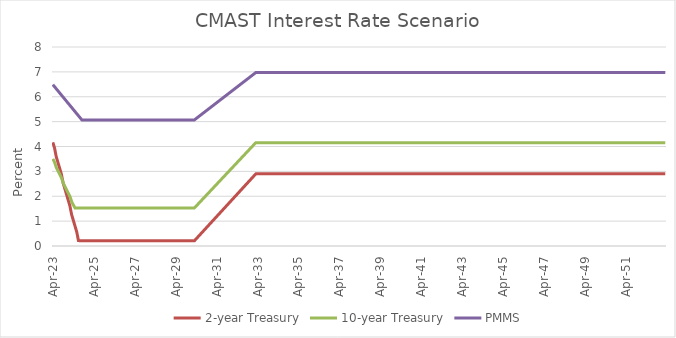
| Category | 2-year Treasury | 10-year Treasury | PMMS |
|---|---|---|---|
| 2023-04-30 | 4.168 | 3.503 | 6.487 |
| 2023-05-30 | 3.935 | 3.366 | 6.403 |
| 2023-06-30 | 3.587 | 3.16 | 6.32 |
| 2023-07-30 | 3.355 | 3.023 | 6.237 |
| 2023-08-30 | 3.122 | 2.886 | 6.153 |
| 2023-09-30 | 2.89 | 2.749 | 6.07 |
| 2023-10-30 | 2.542 | 2.543 | 5.987 |
| 2023-11-30 | 2.309 | 2.406 | 5.903 |
| 2023-12-30 | 2.077 | 2.269 | 5.82 |
| 2024-01-30 | 1.845 | 2.132 | 5.737 |
| 2024-02-29 | 1.612 | 1.994 | 5.653 |
| 2024-03-29 | 1.264 | 1.789 | 5.57 |
| 2024-04-29 | 1.031 | 1.652 | 5.487 |
| 2024-05-29 | 0.799 | 1.53 | 5.403 |
| 2024-06-29 | 0.567 | 1.53 | 5.32 |
| 2024-07-29 | 0.218 | 1.53 | 5.237 |
| 2024-08-29 | 0.21 | 1.53 | 5.153 |
| 2024-09-29 | 0.21 | 1.53 | 5.07 |
| 2024-10-29 | 0.21 | 1.53 | 5.07 |
| 2024-11-29 | 0.21 | 1.53 | 5.07 |
| 2024-12-29 | 0.21 | 1.53 | 5.07 |
| 2025-01-29 | 0.21 | 1.53 | 5.07 |
| 2025-02-28 | 0.21 | 1.53 | 5.07 |
| 2025-03-28 | 0.21 | 1.53 | 5.07 |
| 2025-04-28 | 0.21 | 1.53 | 5.07 |
| 2025-05-28 | 0.21 | 1.53 | 5.07 |
| 2025-06-28 | 0.21 | 1.53 | 5.07 |
| 2025-07-28 | 0.21 | 1.53 | 5.07 |
| 2025-08-28 | 0.21 | 1.53 | 5.07 |
| 2025-09-28 | 0.21 | 1.53 | 5.07 |
| 2025-10-28 | 0.21 | 1.53 | 5.07 |
| 2025-11-28 | 0.21 | 1.53 | 5.07 |
| 2025-12-28 | 0.21 | 1.53 | 5.07 |
| 2026-01-28 | 0.21 | 1.53 | 5.07 |
| 2026-02-28 | 0.21 | 1.53 | 5.07 |
| 2026-03-28 | 0.21 | 1.53 | 5.07 |
| 2026-04-28 | 0.21 | 1.53 | 5.07 |
| 2026-05-28 | 0.21 | 1.53 | 5.07 |
| 2026-06-28 | 0.21 | 1.53 | 5.07 |
| 2026-07-28 | 0.21 | 1.53 | 5.07 |
| 2026-08-28 | 0.21 | 1.53 | 5.07 |
| 2026-09-28 | 0.21 | 1.53 | 5.07 |
| 2026-10-28 | 0.21 | 1.53 | 5.07 |
| 2026-11-28 | 0.21 | 1.53 | 5.07 |
| 2026-12-28 | 0.21 | 1.53 | 5.07 |
| 2027-01-28 | 0.21 | 1.53 | 5.07 |
| 2027-02-28 | 0.21 | 1.53 | 5.07 |
| 2027-03-28 | 0.21 | 1.53 | 5.07 |
| 2027-04-28 | 0.21 | 1.53 | 5.07 |
| 2027-05-28 | 0.21 | 1.53 | 5.07 |
| 2027-06-28 | 0.21 | 1.53 | 5.07 |
| 2027-07-28 | 0.21 | 1.53 | 5.07 |
| 2027-08-28 | 0.21 | 1.53 | 5.07 |
| 2027-09-28 | 0.21 | 1.53 | 5.07 |
| 2027-10-28 | 0.21 | 1.53 | 5.07 |
| 2027-11-28 | 0.21 | 1.53 | 5.07 |
| 2027-12-28 | 0.21 | 1.53 | 5.07 |
| 2028-01-28 | 0.21 | 1.53 | 5.07 |
| 2028-02-28 | 0.21 | 1.53 | 5.07 |
| 2028-03-28 | 0.21 | 1.53 | 5.07 |
| 2028-04-28 | 0.21 | 1.53 | 5.07 |
| 2028-05-28 | 0.21 | 1.53 | 5.07 |
| 2028-06-28 | 0.21 | 1.53 | 5.07 |
| 2028-07-28 | 0.21 | 1.53 | 5.07 |
| 2028-08-28 | 0.21 | 1.53 | 5.07 |
| 2028-09-28 | 0.21 | 1.53 | 5.07 |
| 2028-10-28 | 0.21 | 1.53 | 5.07 |
| 2028-11-28 | 0.21 | 1.53 | 5.07 |
| 2028-12-28 | 0.21 | 1.53 | 5.07 |
| 2029-01-28 | 0.21 | 1.53 | 5.07 |
| 2029-02-28 | 0.21 | 1.53 | 5.07 |
| 2029-03-28 | 0.21 | 1.53 | 5.07 |
| 2029-04-28 | 0.21 | 1.53 | 5.07 |
| 2029-05-28 | 0.21 | 1.53 | 5.07 |
| 2029-06-28 | 0.21 | 1.53 | 5.07 |
| 2029-07-28 | 0.21 | 1.53 | 5.07 |
| 2029-08-28 | 0.21 | 1.53 | 5.07 |
| 2029-09-28 | 0.21 | 1.53 | 5.07 |
| 2029-10-28 | 0.21 | 1.53 | 5.07 |
| 2029-11-28 | 0.21 | 1.53 | 5.07 |
| 2029-12-28 | 0.21 | 1.53 | 5.07 |
| 2030-01-28 | 0.21 | 1.53 | 5.07 |
| 2030-02-28 | 0.21 | 1.53 | 5.07 |
| 2030-03-28 | 0.21 | 1.53 | 5.07 |
| 2030-04-28 | 0.285 | 1.603 | 5.123 |
| 2030-05-28 | 0.359 | 1.676 | 5.176 |
| 2030-06-28 | 0.434 | 1.749 | 5.229 |
| 2030-07-28 | 0.509 | 1.822 | 5.281 |
| 2030-08-28 | 0.584 | 1.895 | 5.334 |
| 2030-09-28 | 0.658 | 1.968 | 5.387 |
| 2030-10-28 | 0.733 | 2.04 | 5.44 |
| 2030-11-28 | 0.808 | 2.113 | 5.493 |
| 2030-12-28 | 0.883 | 2.186 | 5.546 |
| 2031-01-28 | 0.957 | 2.259 | 5.599 |
| 2031-02-28 | 1.032 | 2.332 | 5.652 |
| 2031-03-28 | 1.107 | 2.405 | 5.704 |
| 2031-04-28 | 1.181 | 2.478 | 5.757 |
| 2031-05-28 | 1.256 | 2.551 | 5.81 |
| 2031-06-28 | 1.331 | 2.624 | 5.863 |
| 2031-07-28 | 1.406 | 2.697 | 5.916 |
| 2031-08-28 | 1.48 | 2.77 | 5.969 |
| 2031-09-28 | 1.555 | 2.843 | 6.022 |
| 2031-10-28 | 1.63 | 2.915 | 6.074 |
| 2031-11-28 | 1.704 | 2.988 | 6.127 |
| 2031-12-28 | 1.779 | 3.061 | 6.18 |
| 2032-01-28 | 1.854 | 3.134 | 6.233 |
| 2032-02-28 | 1.929 | 3.207 | 6.286 |
| 2032-03-28 | 2.003 | 3.28 | 6.339 |
| 2032-04-28 | 2.078 | 3.353 | 6.392 |
| 2032-05-28 | 2.153 | 3.426 | 6.444 |
| 2032-06-28 | 2.228 | 3.499 | 6.497 |
| 2032-07-28 | 2.302 | 3.572 | 6.55 |
| 2032-08-28 | 2.377 | 3.645 | 6.603 |
| 2032-09-28 | 2.452 | 3.718 | 6.656 |
| 2032-10-28 | 2.526 | 3.79 | 6.709 |
| 2032-11-28 | 2.601 | 3.863 | 6.762 |
| 2032-12-28 | 2.676 | 3.936 | 6.815 |
| 2033-01-28 | 2.751 | 4.009 | 6.867 |
| 2033-02-28 | 2.825 | 4.082 | 6.92 |
| 2033-03-28 | 2.9 | 4.155 | 6.973 |
| 2033-04-28 | 2.9 | 4.155 | 6.973 |
| 2033-05-28 | 2.9 | 4.155 | 6.973 |
| 2033-06-28 | 2.9 | 4.155 | 6.973 |
| 2033-07-28 | 2.9 | 4.155 | 6.973 |
| 2033-08-28 | 2.9 | 4.155 | 6.973 |
| 2033-09-28 | 2.9 | 4.155 | 6.973 |
| 2033-10-28 | 2.9 | 4.155 | 6.973 |
| 2033-11-28 | 2.9 | 4.155 | 6.973 |
| 2033-12-28 | 2.9 | 4.155 | 6.973 |
| 2034-01-28 | 2.9 | 4.155 | 6.973 |
| 2034-02-28 | 2.9 | 4.155 | 6.973 |
| 2034-03-28 | 2.9 | 4.155 | 6.973 |
| 2034-04-28 | 2.9 | 4.155 | 6.973 |
| 2034-05-28 | 2.9 | 4.155 | 6.973 |
| 2034-06-28 | 2.9 | 4.155 | 6.973 |
| 2034-07-28 | 2.9 | 4.155 | 6.973 |
| 2034-08-28 | 2.9 | 4.155 | 6.973 |
| 2034-09-28 | 2.9 | 4.155 | 6.973 |
| 2034-10-28 | 2.9 | 4.155 | 6.973 |
| 2034-11-28 | 2.9 | 4.155 | 6.973 |
| 2034-12-28 | 2.9 | 4.155 | 6.973 |
| 2035-01-28 | 2.9 | 4.155 | 6.973 |
| 2035-02-28 | 2.9 | 4.155 | 6.973 |
| 2035-03-28 | 2.9 | 4.155 | 6.973 |
| 2035-04-28 | 2.9 | 4.155 | 6.973 |
| 2035-05-28 | 2.9 | 4.155 | 6.973 |
| 2035-06-28 | 2.9 | 4.155 | 6.973 |
| 2035-07-28 | 2.9 | 4.155 | 6.973 |
| 2035-08-28 | 2.9 | 4.155 | 6.973 |
| 2035-09-28 | 2.9 | 4.155 | 6.973 |
| 2035-10-28 | 2.9 | 4.155 | 6.973 |
| 2035-11-28 | 2.9 | 4.155 | 6.973 |
| 2035-12-28 | 2.9 | 4.155 | 6.973 |
| 2036-01-28 | 2.9 | 4.155 | 6.973 |
| 2036-02-28 | 2.9 | 4.155 | 6.973 |
| 2036-03-28 | 2.9 | 4.155 | 6.973 |
| 2036-04-28 | 2.9 | 4.155 | 6.973 |
| 2036-05-28 | 2.9 | 4.155 | 6.973 |
| 2036-06-28 | 2.9 | 4.155 | 6.973 |
| 2036-07-28 | 2.9 | 4.155 | 6.973 |
| 2036-08-28 | 2.9 | 4.155 | 6.973 |
| 2036-09-28 | 2.9 | 4.155 | 6.973 |
| 2036-10-28 | 2.9 | 4.155 | 6.973 |
| 2036-11-28 | 2.9 | 4.155 | 6.973 |
| 2036-12-28 | 2.9 | 4.155 | 6.973 |
| 2037-01-28 | 2.9 | 4.155 | 6.973 |
| 2037-02-28 | 2.9 | 4.155 | 6.973 |
| 2037-03-28 | 2.9 | 4.155 | 6.973 |
| 2037-04-28 | 2.9 | 4.155 | 6.973 |
| 2037-05-28 | 2.9 | 4.155 | 6.973 |
| 2037-06-28 | 2.9 | 4.155 | 6.973 |
| 2037-07-28 | 2.9 | 4.155 | 6.973 |
| 2037-08-28 | 2.9 | 4.155 | 6.973 |
| 2037-09-28 | 2.9 | 4.155 | 6.973 |
| 2037-10-28 | 2.9 | 4.155 | 6.973 |
| 2037-11-28 | 2.9 | 4.155 | 6.973 |
| 2037-12-28 | 2.9 | 4.155 | 6.973 |
| 2038-01-28 | 2.9 | 4.155 | 6.973 |
| 2038-02-28 | 2.9 | 4.155 | 6.973 |
| 2038-03-28 | 2.9 | 4.155 | 6.973 |
| 2038-04-28 | 2.9 | 4.155 | 6.973 |
| 2038-05-28 | 2.9 | 4.155 | 6.973 |
| 2038-06-28 | 2.9 | 4.155 | 6.973 |
| 2038-07-28 | 2.9 | 4.155 | 6.973 |
| 2038-08-28 | 2.9 | 4.155 | 6.973 |
| 2038-09-28 | 2.9 | 4.155 | 6.973 |
| 2038-10-28 | 2.9 | 4.155 | 6.973 |
| 2038-11-28 | 2.9 | 4.155 | 6.973 |
| 2038-12-28 | 2.9 | 4.155 | 6.973 |
| 2039-01-28 | 2.9 | 4.155 | 6.973 |
| 2039-02-28 | 2.9 | 4.155 | 6.973 |
| 2039-03-28 | 2.9 | 4.155 | 6.973 |
| 2039-04-28 | 2.9 | 4.155 | 6.973 |
| 2039-05-28 | 2.9 | 4.155 | 6.973 |
| 2039-06-28 | 2.9 | 4.155 | 6.973 |
| 2039-07-28 | 2.9 | 4.155 | 6.973 |
| 2039-08-28 | 2.9 | 4.155 | 6.973 |
| 2039-09-28 | 2.9 | 4.155 | 6.973 |
| 2039-10-28 | 2.9 | 4.155 | 6.973 |
| 2039-11-28 | 2.9 | 4.155 | 6.973 |
| 2039-12-28 | 2.9 | 4.155 | 6.973 |
| 2040-01-28 | 2.9 | 4.155 | 6.973 |
| 2040-02-28 | 2.9 | 4.155 | 6.973 |
| 2040-03-28 | 2.9 | 4.155 | 6.973 |
| 2040-04-28 | 2.9 | 4.155 | 6.973 |
| 2040-05-28 | 2.9 | 4.155 | 6.973 |
| 2040-06-28 | 2.9 | 4.155 | 6.973 |
| 2040-07-28 | 2.9 | 4.155 | 6.973 |
| 2040-08-28 | 2.9 | 4.155 | 6.973 |
| 2040-09-28 | 2.9 | 4.155 | 6.973 |
| 2040-10-28 | 2.9 | 4.155 | 6.973 |
| 2040-11-28 | 2.9 | 4.155 | 6.973 |
| 2040-12-28 | 2.9 | 4.155 | 6.973 |
| 2041-01-28 | 2.9 | 4.155 | 6.973 |
| 2041-02-28 | 2.9 | 4.155 | 6.973 |
| 2041-03-28 | 2.9 | 4.155 | 6.973 |
| 2041-04-28 | 2.9 | 4.155 | 6.973 |
| 2041-05-28 | 2.9 | 4.155 | 6.973 |
| 2041-06-28 | 2.9 | 4.155 | 6.973 |
| 2041-07-28 | 2.9 | 4.155 | 6.973 |
| 2041-08-28 | 2.9 | 4.155 | 6.973 |
| 2041-09-28 | 2.9 | 4.155 | 6.973 |
| 2041-10-28 | 2.9 | 4.155 | 6.973 |
| 2041-11-28 | 2.9 | 4.155 | 6.973 |
| 2041-12-28 | 2.9 | 4.155 | 6.973 |
| 2042-01-28 | 2.9 | 4.155 | 6.973 |
| 2042-02-28 | 2.9 | 4.155 | 6.973 |
| 2042-03-28 | 2.9 | 4.155 | 6.973 |
| 2042-04-28 | 2.9 | 4.155 | 6.973 |
| 2042-05-28 | 2.9 | 4.155 | 6.973 |
| 2042-06-28 | 2.9 | 4.155 | 6.973 |
| 2042-07-28 | 2.9 | 4.155 | 6.973 |
| 2042-08-28 | 2.9 | 4.155 | 6.973 |
| 2042-09-28 | 2.9 | 4.155 | 6.973 |
| 2042-10-28 | 2.9 | 4.155 | 6.973 |
| 2042-11-28 | 2.9 | 4.155 | 6.973 |
| 2042-12-28 | 2.9 | 4.155 | 6.973 |
| 2043-01-28 | 2.9 | 4.155 | 6.973 |
| 2043-02-28 | 2.9 | 4.155 | 6.973 |
| 2043-03-28 | 2.9 | 4.155 | 6.973 |
| 2043-04-28 | 2.9 | 4.155 | 6.973 |
| 2043-05-28 | 2.9 | 4.155 | 6.973 |
| 2043-06-28 | 2.9 | 4.155 | 6.973 |
| 2043-07-28 | 2.9 | 4.155 | 6.973 |
| 2043-08-28 | 2.9 | 4.155 | 6.973 |
| 2043-09-28 | 2.9 | 4.155 | 6.973 |
| 2043-10-28 | 2.9 | 4.155 | 6.973 |
| 2043-11-28 | 2.9 | 4.155 | 6.973 |
| 2043-12-28 | 2.9 | 4.155 | 6.973 |
| 2044-01-28 | 2.9 | 4.155 | 6.973 |
| 2044-02-28 | 2.9 | 4.155 | 6.973 |
| 2044-03-28 | 2.9 | 4.155 | 6.973 |
| 2044-04-28 | 2.9 | 4.155 | 6.973 |
| 2044-05-28 | 2.9 | 4.155 | 6.973 |
| 2044-06-28 | 2.9 | 4.155 | 6.973 |
| 2044-07-28 | 2.9 | 4.155 | 6.973 |
| 2044-08-28 | 2.9 | 4.155 | 6.973 |
| 2044-09-28 | 2.9 | 4.155 | 6.973 |
| 2044-10-28 | 2.9 | 4.155 | 6.973 |
| 2044-11-28 | 2.9 | 4.155 | 6.973 |
| 2044-12-28 | 2.9 | 4.155 | 6.973 |
| 2045-01-28 | 2.9 | 4.155 | 6.973 |
| 2045-02-28 | 2.9 | 4.155 | 6.973 |
| 2045-03-28 | 2.9 | 4.155 | 6.973 |
| 2045-04-28 | 2.9 | 4.155 | 6.973 |
| 2045-05-28 | 2.9 | 4.155 | 6.973 |
| 2045-06-28 | 2.9 | 4.155 | 6.973 |
| 2045-07-28 | 2.9 | 4.155 | 6.973 |
| 2045-08-28 | 2.9 | 4.155 | 6.973 |
| 2045-09-28 | 2.9 | 4.155 | 6.973 |
| 2045-10-28 | 2.9 | 4.155 | 6.973 |
| 2045-11-28 | 2.9 | 4.155 | 6.973 |
| 2045-12-28 | 2.9 | 4.155 | 6.973 |
| 2046-01-28 | 2.9 | 4.155 | 6.973 |
| 2046-02-28 | 2.9 | 4.155 | 6.973 |
| 2046-03-28 | 2.9 | 4.155 | 6.973 |
| 2046-04-28 | 2.9 | 4.155 | 6.973 |
| 2046-05-28 | 2.9 | 4.155 | 6.973 |
| 2046-06-28 | 2.9 | 4.155 | 6.973 |
| 2046-07-28 | 2.9 | 4.155 | 6.973 |
| 2046-08-28 | 2.9 | 4.155 | 6.973 |
| 2046-09-28 | 2.9 | 4.155 | 6.973 |
| 2046-10-28 | 2.9 | 4.155 | 6.973 |
| 2046-11-28 | 2.9 | 4.155 | 6.973 |
| 2046-12-28 | 2.9 | 4.155 | 6.973 |
| 2047-01-28 | 2.9 | 4.155 | 6.973 |
| 2047-02-28 | 2.9 | 4.155 | 6.973 |
| 2047-03-28 | 2.9 | 4.155 | 6.973 |
| 2047-04-28 | 2.9 | 4.155 | 6.973 |
| 2047-05-28 | 2.9 | 4.155 | 6.973 |
| 2047-06-28 | 2.9 | 4.155 | 6.973 |
| 2047-07-28 | 2.9 | 4.155 | 6.973 |
| 2047-08-28 | 2.9 | 4.155 | 6.973 |
| 2047-09-28 | 2.9 | 4.155 | 6.973 |
| 2047-10-28 | 2.9 | 4.155 | 6.973 |
| 2047-11-28 | 2.9 | 4.155 | 6.973 |
| 2047-12-28 | 2.9 | 4.155 | 6.973 |
| 2048-01-28 | 2.9 | 4.155 | 6.973 |
| 2048-02-28 | 2.9 | 4.155 | 6.973 |
| 2048-03-28 | 2.9 | 4.155 | 6.973 |
| 2048-04-28 | 2.9 | 4.155 | 6.973 |
| 2048-05-28 | 2.9 | 4.155 | 6.973 |
| 2048-06-28 | 2.9 | 4.155 | 6.973 |
| 2048-07-28 | 2.9 | 4.155 | 6.973 |
| 2048-08-28 | 2.9 | 4.155 | 6.973 |
| 2048-09-28 | 2.9 | 4.155 | 6.973 |
| 2048-10-28 | 2.9 | 4.155 | 6.973 |
| 2048-11-28 | 2.9 | 4.155 | 6.973 |
| 2048-12-28 | 2.9 | 4.155 | 6.973 |
| 2049-01-28 | 2.9 | 4.155 | 6.973 |
| 2049-02-28 | 2.9 | 4.155 | 6.973 |
| 2049-03-28 | 2.9 | 4.155 | 6.973 |
| 2049-04-28 | 2.9 | 4.155 | 6.973 |
| 2049-05-28 | 2.9 | 4.155 | 6.973 |
| 2049-06-28 | 2.9 | 4.155 | 6.973 |
| 2049-07-28 | 2.9 | 4.155 | 6.973 |
| 2049-08-28 | 2.9 | 4.155 | 6.973 |
| 2049-09-28 | 2.9 | 4.155 | 6.973 |
| 2049-10-28 | 2.9 | 4.155 | 6.973 |
| 2049-11-28 | 2.9 | 4.155 | 6.973 |
| 2049-12-28 | 2.9 | 4.155 | 6.973 |
| 2050-01-28 | 2.9 | 4.155 | 6.973 |
| 2050-02-28 | 2.9 | 4.155 | 6.973 |
| 2050-03-28 | 2.9 | 4.155 | 6.973 |
| 2050-04-28 | 2.9 | 4.155 | 6.973 |
| 2050-05-28 | 2.9 | 4.155 | 6.973 |
| 2050-06-28 | 2.9 | 4.155 | 6.973 |
| 2050-07-28 | 2.9 | 4.155 | 6.973 |
| 2050-08-28 | 2.9 | 4.155 | 6.973 |
| 2050-09-28 | 2.9 | 4.155 | 6.973 |
| 2050-10-28 | 2.9 | 4.155 | 6.973 |
| 2050-11-28 | 2.9 | 4.155 | 6.973 |
| 2050-12-28 | 2.9 | 4.155 | 6.973 |
| 2051-01-28 | 2.9 | 4.155 | 6.973 |
| 2051-02-28 | 2.9 | 4.155 | 6.973 |
| 2051-03-28 | 2.9 | 4.155 | 6.973 |
| 2051-04-28 | 2.9 | 4.155 | 6.973 |
| 2051-05-28 | 2.9 | 4.155 | 6.973 |
| 2051-06-28 | 2.9 | 4.155 | 6.973 |
| 2051-07-28 | 2.9 | 4.155 | 6.973 |
| 2051-08-28 | 2.9 | 4.155 | 6.973 |
| 2051-09-28 | 2.9 | 4.155 | 6.973 |
| 2051-10-28 | 2.9 | 4.155 | 6.973 |
| 2051-11-28 | 2.9 | 4.155 | 6.973 |
| 2051-12-28 | 2.9 | 4.155 | 6.973 |
| 2052-01-28 | 2.9 | 4.155 | 6.973 |
| 2052-02-28 | 2.9 | 4.155 | 6.973 |
| 2052-03-28 | 2.9 | 4.155 | 6.973 |
| 2052-04-28 | 2.9 | 4.155 | 6.973 |
| 2052-05-28 | 2.9 | 4.155 | 6.973 |
| 2052-06-28 | 2.9 | 4.155 | 6.973 |
| 2052-07-28 | 2.9 | 4.155 | 6.973 |
| 2052-08-28 | 2.9 | 4.155 | 6.973 |
| 2052-09-28 | 2.9 | 4.155 | 6.973 |
| 2052-10-28 | 2.9 | 4.155 | 6.973 |
| 2052-11-28 | 2.9 | 4.155 | 6.973 |
| 2052-12-28 | 2.9 | 4.155 | 6.973 |
| 2053-01-28 | 2.9 | 4.155 | 6.973 |
| 2053-02-28 | 2.9 | 4.155 | 6.973 |
| 2053-03-28 | 2.9 | 4.155 | 6.973 |